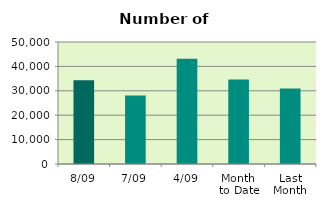
| Category | Series 0 |
|---|---|
| 8/09 | 34358 |
| 7/09 | 28054 |
| 4/09 | 43174 |
| Month 
to Date | 34589.333 |
| Last
Month | 30949.143 |